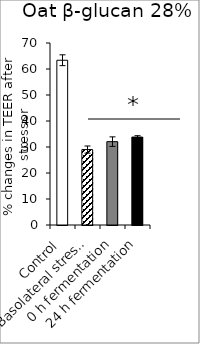
| Category | average |
|---|---|
| Control | 63.37 |
| Basolateral stressor | 29.013 |
| 0 h fermentation | 32.066 |
| 24 h fermentation | 33.821 |